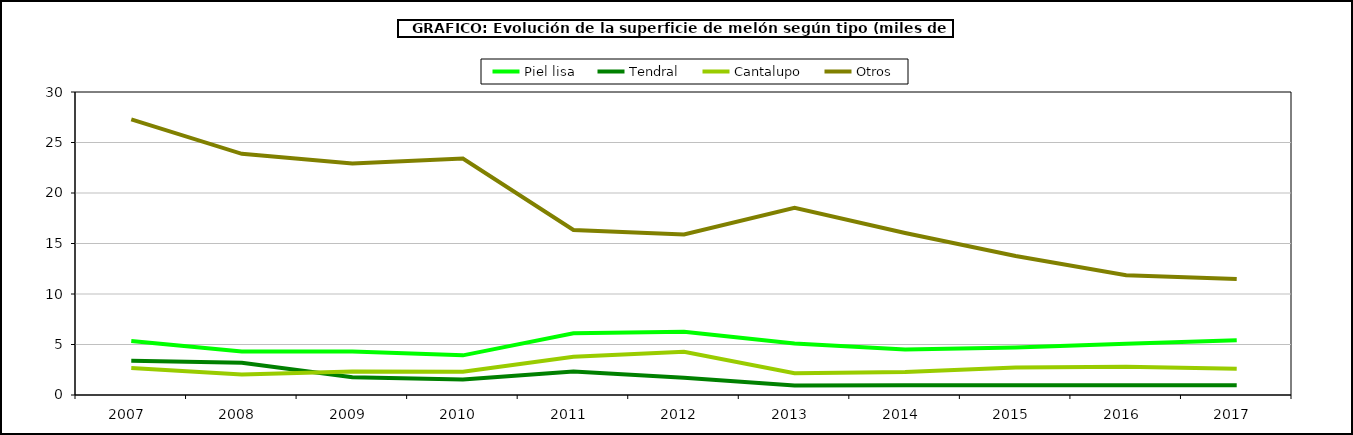
| Category | Piel lisa | Tendral | Cantalupo | Otros |
|---|---|---|---|---|
| 2007.0 | 5.353 | 3.385 | 2.669 | 27.281 |
| 2008.0 | 4.312 | 3.181 | 2.02 | 23.875 |
| 2009.0 | 4.319 | 1.755 | 2.33 | 22.923 |
| 2010.0 | 3.925 | 1.546 | 2.308 | 23.409 |
| 2011.0 | 6.109 | 2.318 | 3.791 | 16.343 |
| 2012.0 | 6.265 | 1.708 | 4.27 | 15.887 |
| 2013.0 | 5.109 | 0.939 | 2.152 | 18.523 |
| 2014.0 | 4.503 | 0.973 | 2.277 | 16.047 |
| 2015.0 | 4.698 | 0.96 | 2.723 | 13.763 |
| 2016.0 | 5.074 | 0.966 | 2.793 | 11.853 |
| 2017.0 | 5.417 | 0.953 | 2.608 | 11.495 |